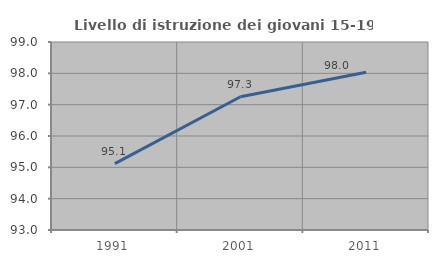
| Category | Livello di istruzione dei giovani 15-19 anni |
|---|---|
| 1991.0 | 95.121 |
| 2001.0 | 97.251 |
| 2011.0 | 98.031 |